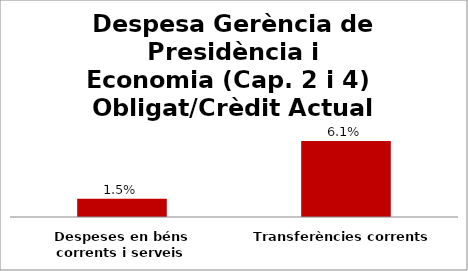
| Category | Series 0 |
|---|---|
| Despeses en béns corrents i serveis | 0.015 |
| Transferències corrents | 0.061 |